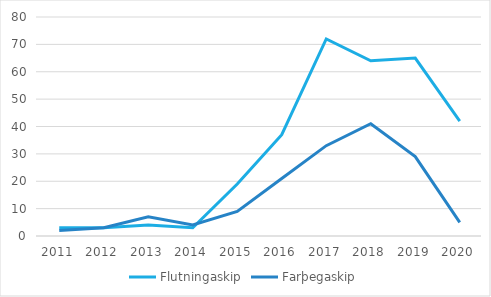
| Category | Flutningaskip | Farþegaskip |
|---|---|---|
| 2011.0 | 3 | 2 |
| 2012.0 | 3 | 3 |
| 2013.0 | 4 | 7 |
| 2014.0 | 3 | 4 |
| 2015.0 | 19 | 9 |
| 2016.0 | 37 | 21 |
| 2017.0 | 72 | 33 |
| 2018.0 | 64 | 41 |
| 2019.0 | 65 | 29 |
| 2020.0 | 42 | 5 |